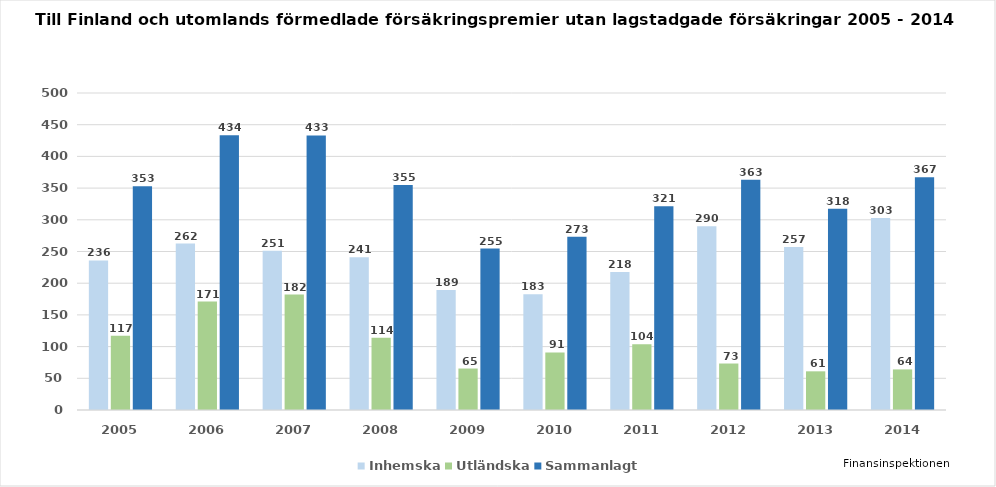
| Category | Inhemska | Utländska | Sammanlagt |
|---|---|---|---|
| 2005.0 | 236 | 117 | 353 |
| 2006.0 | 262.471 | 171.056 | 433.526 |
| 2007.0 | 251 | 182 | 433 |
| 2008.0 | 241 | 114 | 355 |
| 2009.0 | 189.249 | 65.417 | 254.666 |
| 2010.0 | 182.562 | 90.729 | 273.291 |
| 2011.0 | 217.55 | 103.894 | 321.444 |
| 2012.0 | 289.922 | 73.321 | 363.243 |
| 2013.0 | 257 | 61 | 317.523 |
| 2014.0 | 303 | 64 | 367 |